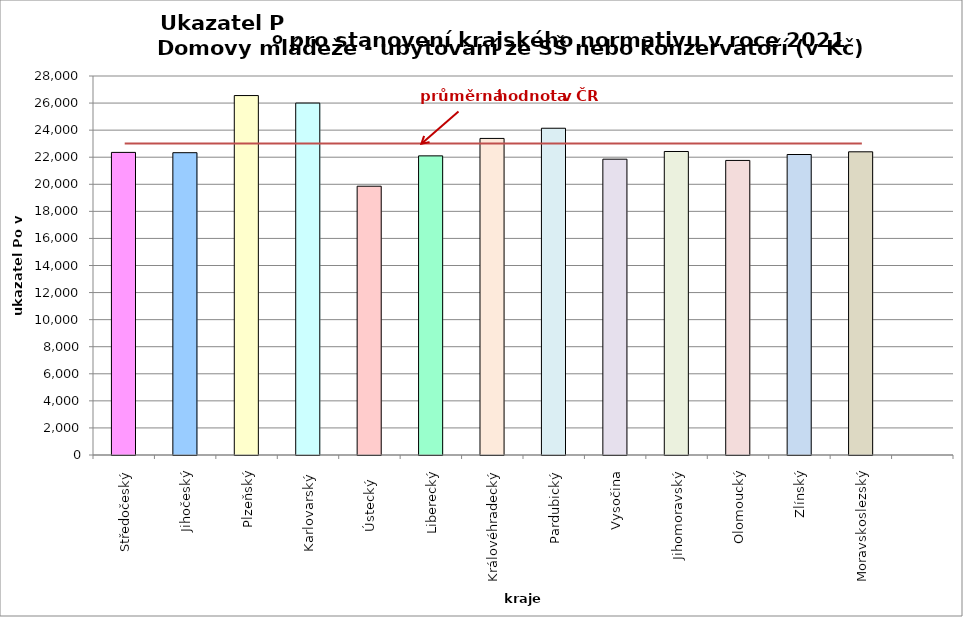
| Category | Series 0 |
|---|---|
| Středočeský | 22356 |
| Jihočeský | 22334 |
| Plzeňský | 26555 |
| Karlovarský  | 26000 |
| Ústecký   | 19858 |
| Liberecký | 22100 |
| Královéhradecký | 23388 |
| Pardubický | 24140 |
| Vysočina | 21855 |
| Jihomoravský | 22423 |
| Olomoucký | 21763 |
| Zlínský | 22200 |
| Moravskoslezský | 22400 |